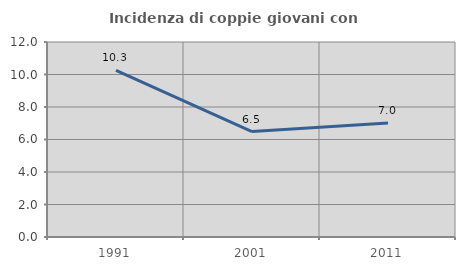
| Category | Incidenza di coppie giovani con figli |
|---|---|
| 1991.0 | 10.256 |
| 2001.0 | 6.486 |
| 2011.0 | 7.013 |